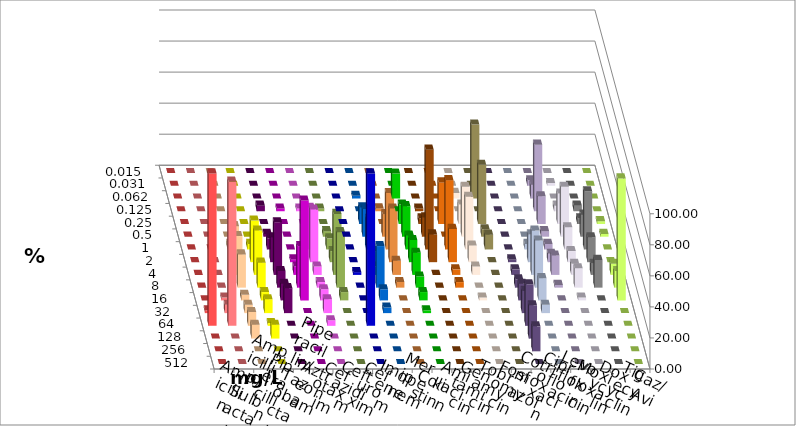
| Category | Ampicillin | Ampicillin/ Sulbactam | Piperacillin | Piperacillin/ Tazobactam | Aztreonam | Cefotaxim | Ceftazidim | Cefuroxim | Imipenem | Meropenem | Colistin | Amikacin | Gentamicin | Tobramycin | Fosfomycin | Cotrimoxazol | Ciprofloxacin | Levofloxacin | Moxifloxacin | Doxycyclin | Tigecyclin | Caz/Avi |
|---|---|---|---|---|---|---|---|---|---|---|---|---|---|---|---|---|---|---|---|---|---|---|
| 0.015 | 0 | 0 | 0 | 0 | 0 | 0 | 0 | 0 | 0 | 0 | 0 | 0 | 0 | 0 | 0 | 0 | 0 | 0 | 0 | 0 | 0 | 0 |
| 0.031 | 0 | 0 | 0 | 0 | 0 | 0 | 0 | 0 | 0 | 0 | 0 | 0 | 0 | 0 | 0 | 0 | 3.571 | 1.786 | 0 | 0 | 0 | 0 |
| 0.062 | 0 | 0 | 0 | 0 | 0 | 0 | 0 | 0 | 1.786 | 16.071 | 0 | 0 | 3.571 | 47.619 | 0 | 0 | 8.929 | 0 | 0 | 0 | 0 | 0 |
| 0.125 | 0 | 0 | 0 | 0 | 3.571 | 1.786 | 1.786 | 0 | 0 | 0 | 1.786 | 0 | 0 | 0 | 0 | 0 | 42.857 | 3.571 | 3.571 | 0 | 1.786 | 1.818 |
| 0.25 | 0 | 0 | 0 | 0 | 0 | 0 | 0 | 0 | 10.714 | 12.5 | 3.571 | 26.786 | 12.5 | 38.095 | 0 | 0 | 17.857 | 19.643 | 3.571 | 1.786 | 0 | 0 |
| 0.5 | 0 | 0 | 0 | 0 | 1.786 | 0 | 8.929 | 0 | 17.857 | 19.643 | 12.5 | 0 | 32.143 | 4.762 | 0 | 0 | 3.571 | 32.143 | 14.286 | 1.786 | 3.571 | 14.545 |
| 1.0 | 0 | 0 | 3.571 | 3.571 | 7.143 | 0 | 26.786 | 0 | 19.643 | 8.929 | 64.286 | 44.643 | 33.929 | 9.524 | 0 | 3.571 | 3.571 | 14.286 | 37.5 | 0 | 7.143 | 36.364 |
| 2.0 | 0 | 0 | 23.214 | 26.786 | 16.071 | 1.786 | 33.929 | 0 | 7.143 | 14.286 | 17.857 | 21.429 | 10.714 | 0 | 1.786 | 17.857 | 5.357 | 7.143 | 16.071 | 0 | 7.143 | 34.545 |
| 4.0 | 0 | 0 | 25 | 28.571 | 33.929 | 5.357 | 5.357 | 1.786 | 5.357 | 14.286 | 0 | 3.571 | 5.357 | 0 | 3.571 | 28.571 | 12.5 | 7.143 | 7.143 | 7.143 | 39.286 | 9.091 |
| 8.0 | 0 | 0 | 21.429 | 16.071 | 10.714 | 26.786 | 3.571 | 0 | 26.786 | 7.143 | 0 | 3.571 | 0 | 0 | 5.357 | 30.357 | 1.786 | 12.5 | 17.857 | 10.714 | 35.714 | 3.636 |
| 16.0 | 0 | 1.786 | 3.571 | 5.357 | 10.714 | 64.286 | 7.143 | 0 | 7.143 | 5.357 | 0 | 0 | 1.786 | 0 | 10.714 | 14.286 | 0 | 1.786 | 0 | 78.571 | 5.357 | 0 |
| 32.0 | 1.786 | 5.357 | 5.357 | 8.929 | 16.071 | 0 | 8.929 | 0 | 3.571 | 1.786 | 0 | 0 | 0 | 0 | 14.286 | 5.357 | 0 | 0 | 0 | 0 | 0 | 0 |
| 64.0 | 98.214 | 92.857 | 8.929 | 1.786 | 0 | 0 | 3.571 | 98.214 | 0 | 0 | 0 | 0 | 0 | 0 | 26.786 | 0 | 0 | 0 | 0 | 0 | 0 | 0 |
| 128.0 | 0 | 0 | 8.929 | 8.929 | 0 | 0 | 0 | 0 | 0 | 0 | 0 | 0 | 0 | 0 | 21.429 | 0 | 0 | 0 | 0 | 0 | 0 | 0 |
| 256.0 | 0 | 0 | 0 | 0 | 0 | 0 | 0 | 0 | 0 | 0 | 0 | 0 | 0 | 0 | 16.071 | 0 | 0 | 0 | 0 | 0 | 0 | 0 |
| 512.0 | 0 | 0 | 0 | 0 | 0 | 0 | 0 | 0 | 0 | 0 | 0 | 0 | 0 | 0 | 0 | 0 | 0 | 0 | 0 | 0 | 0 | 0 |